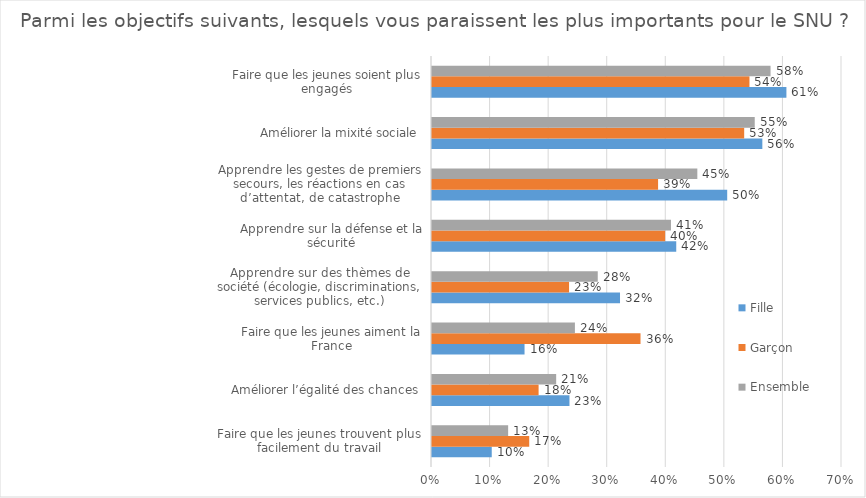
| Category | Fille | Garçon | Ensemble |
|---|---|---|---|
| Faire que les jeunes trouvent plus facilement du travail | 0.102 | 0.166 | 0.13 |
| Améliorer l’égalité des chances | 0.235 | 0.182 | 0.212 |
| Faire que les jeunes aiment la France | 0.158 | 0.356 | 0.244 |
| Apprendre sur des thèmes de société (écologie, discriminations, services publics, etc.) | 0.321 | 0.234 | 0.283 |
| Apprendre sur la défense et la sécurité | 0.417 | 0.398 | 0.408 |
| Apprendre les gestes de premiers secours, les réactions en cas d’attentat, de catastrophe | 0.504 | 0.386 | 0.453 |
| Améliorer la mixité sociale | 0.564 | 0.533 | 0.551 |
| Faire que les jeunes soient plus engagés | 0.605 | 0.542 | 0.578 |